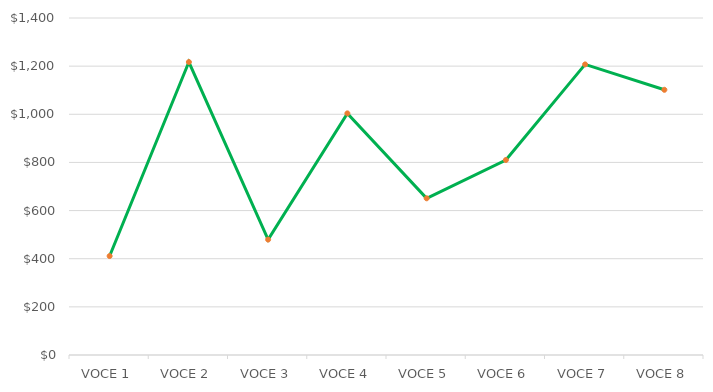
| Category | Series 1 |
|---|---|
| VOCE 1 | 411.07 |
| VOCE 2 | 1217.065 |
| VOCE 3 | 479.5 |
| VOCE 4 | 1003.75 |
| VOCE 5 | 651 |
| VOCE 6 | 810 |
| VOCE 7 | 1207.25 |
| VOCE 8 | 1101.76 |